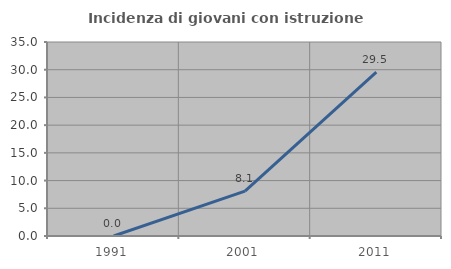
| Category | Incidenza di giovani con istruzione universitaria |
|---|---|
| 1991.0 | 0 |
| 2001.0 | 8.108 |
| 2011.0 | 29.545 |